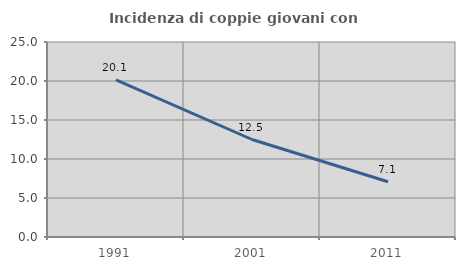
| Category | Incidenza di coppie giovani con figli |
|---|---|
| 1991.0 | 20.132 |
| 2001.0 | 12.5 |
| 2011.0 | 7.082 |